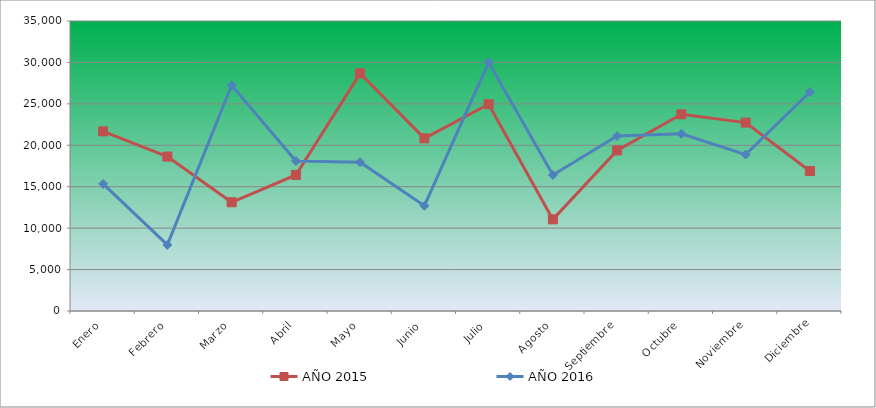
| Category | AÑO 2015 | AÑO 2016 |
|---|---|---|
| Enero | 21680 | 15340 |
| Febrero | 18640 | 7980 |
| Marzo | 13120 | 27240 |
| Abril | 16420 | 18100 |
| Mayo | 28680 | 17960 |
| Junio | 20840 | 12700 |
| Julio | 24960 | 30020 |
| Agosto | 11060 | 16420 |
| Septiembre | 19380 | 21120 |
| Octubre | 23740 | 21380 |
| Noviembre | 22740 | 18880 |
| Diciembre | 16900 | 26430 |